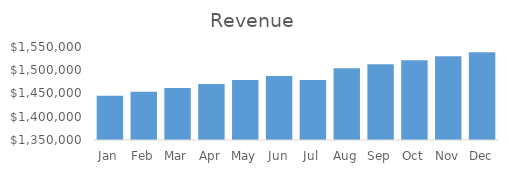
| Category | Total Revenue |
|---|---|
| Jan | 1445000 |
| Feb | 1453500 |
| Mar | 1462000 |
| Apr | 1470500 |
| May | 1479000 |
| Jun | 1487500 |
| Jul | 1479000 |
| Aug | 1504500 |
| Sep | 1513000 |
| Oct | 1521500 |
| Nov | 1530000 |
| Dec | 1538500 |